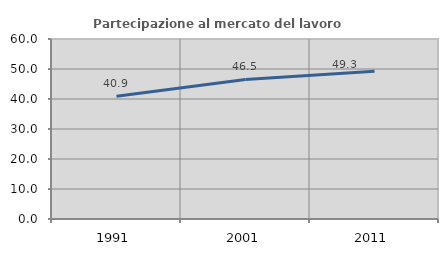
| Category | Partecipazione al mercato del lavoro  femminile |
|---|---|
| 1991.0 | 40.918 |
| 2001.0 | 46.523 |
| 2011.0 | 49.27 |